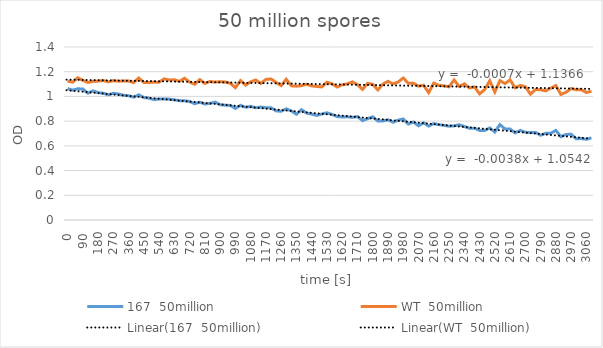
| Category | 167  50million | WT  50million |
|---|---|---|
| 0.0 | 1.064 | 1.124 |
| 30.0 | 1.051 | 1.115 |
| 60.0 | 1.062 | 1.151 |
| 90.0 | 1.06 | 1.13 |
| 120.0 | 1.026 | 1.113 |
| 150.0 | 1.045 | 1.122 |
| 180.0 | 1.031 | 1.124 |
| 210.0 | 1.026 | 1.129 |
| 240.0 | 1.013 | 1.118 |
| 270.0 | 1.025 | 1.128 |
| 300.0 | 1.02 | 1.123 |
| 330.0 | 1.009 | 1.125 |
| 360.0 | 1.006 | 1.125 |
| 390.0 | 0.994 | 1.112 |
| 420.0 | 1.013 | 1.149 |
| 450.0 | 0.991 | 1.113 |
| 480.0 | 0.986 | 1.113 |
| 510.0 | 0.974 | 1.116 |
| 540.0 | 0.979 | 1.115 |
| 570.0 | 0.98 | 1.142 |
| 600.0 | 0.978 | 1.133 |
| 630.0 | 0.973 | 1.135 |
| 660.0 | 0.965 | 1.122 |
| 690.0 | 0.965 | 1.147 |
| 720.0 | 0.959 | 1.116 |
| 750.0 | 0.941 | 1.098 |
| 780.0 | 0.954 | 1.136 |
| 810.0 | 0.938 | 1.105 |
| 840.0 | 0.944 | 1.121 |
| 870.0 | 0.954 | 1.116 |
| 900.0 | 0.933 | 1.119 |
| 930.0 | 0.929 | 1.117 |
| 960.0 | 0.927 | 1.106 |
| 990.0 | 0.903 | 1.071 |
| 1020.0 | 0.928 | 1.128 |
| 1050.0 | 0.912 | 1.092 |
| 1080.0 | 0.92 | 1.118 |
| 1110.0 | 0.908 | 1.133 |
| 1140.0 | 0.914 | 1.105 |
| 1170.0 | 0.909 | 1.138 |
| 1200.0 | 0.909 | 1.141 |
| 1230.0 | 0.883 | 1.114 |
| 1260.0 | 0.88 | 1.087 |
| 1290.0 | 0.9 | 1.139 |
| 1320.0 | 0.883 | 1.086 |
| 1350.0 | 0.856 | 1.083 |
| 1380.0 | 0.893 | 1.087 |
| 1410.0 | 0.865 | 1.099 |
| 1440.0 | 0.857 | 1.085 |
| 1470.0 | 0.846 | 1.081 |
| 1500.0 | 0.858 | 1.077 |
| 1530.0 | 0.868 | 1.115 |
| 1560.0 | 0.854 | 1.102 |
| 1590.0 | 0.837 | 1.076 |
| 1620.0 | 0.834 | 1.094 |
| 1650.0 | 0.835 | 1.102 |
| 1680.0 | 0.831 | 1.118 |
| 1710.0 | 0.837 | 1.095 |
| 1740.0 | 0.804 | 1.057 |
| 1770.0 | 0.82 | 1.106 |
| 1800.0 | 0.835 | 1.098 |
| 1830.0 | 0.801 | 1.053 |
| 1860.0 | 0.801 | 1.1 |
| 1890.0 | 0.811 | 1.122 |
| 1920.0 | 0.791 | 1.101 |
| 1950.0 | 0.808 | 1.117 |
| 1980.0 | 0.818 | 1.149 |
| 2010.0 | 0.777 | 1.106 |
| 2040.0 | 0.793 | 1.107 |
| 2070.0 | 0.763 | 1.083 |
| 2100.0 | 0.787 | 1.09 |
| 2130.0 | 0.76 | 1.031 |
| 2160.0 | 0.78 | 1.108 |
| 2190.0 | 0.772 | 1.089 |
| 2220.0 | 0.766 | 1.086 |
| 2250.0 | 0.759 | 1.078 |
| 2280.0 | 0.762 | 1.133 |
| 2310.0 | 0.771 | 1.08 |
| 2340.0 | 0.757 | 1.102 |
| 2370.0 | 0.742 | 1.068 |
| 2400.0 | 0.743 | 1.077 |
| 2430.0 | 0.725 | 1.021 |
| 2460.0 | 0.724 | 1.055 |
| 2490.0 | 0.745 | 1.127 |
| 2520.0 | 0.712 | 1.036 |
| 2550.0 | 0.772 | 1.128 |
| 2580.0 | 0.737 | 1.104 |
| 2610.0 | 0.736 | 1.134 |
| 2640.0 | 0.705 | 1.07 |
| 2670.0 | 0.725 | 1.089 |
| 2700.0 | 0.71 | 1.079 |
| 2730.0 | 0.707 | 1.019 |
| 2760.0 | 0.709 | 1.056 |
| 2790.0 | 0.686 | 1.054 |
| 2820.0 | 0.701 | 1.045 |
| 2850.0 | 0.702 | 1.067 |
| 2880.0 | 0.725 | 1.088 |
| 2910.0 | 0.674 | 1.016 |
| 2940.0 | 0.692 | 1.034 |
| 2970.0 | 0.694 | 1.064 |
| 3000.0 | 0.658 | 1.054 |
| 3030.0 | 0.659 | 1.055 |
| 3060.0 | 0.653 | 1.032 |
| 3090.0 | 0.665 | 1.042 |